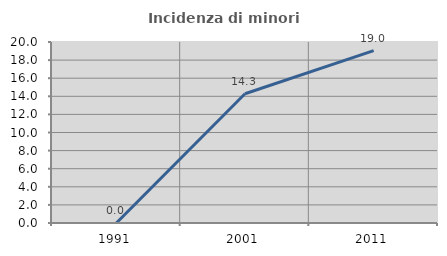
| Category | Incidenza di minori stranieri |
|---|---|
| 1991.0 | 0 |
| 2001.0 | 14.286 |
| 2011.0 | 19.048 |